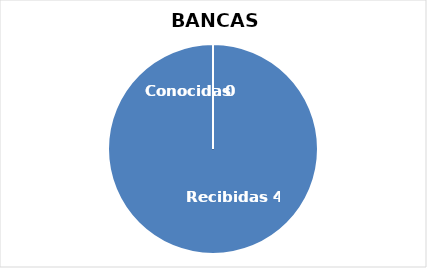
| Category | Series 0 |
|---|---|
| 0 | 42 |
| 1 | 0 |